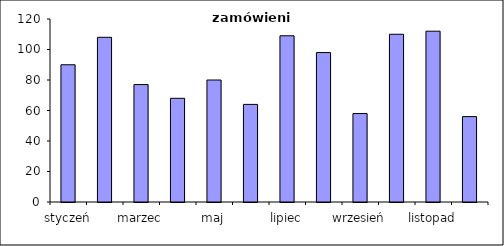
| Category | zamówienia |
|---|---|
| styczeń | 90 |
| luty | 108 |
| marzec | 77 |
| kwiecień | 68 |
| maj | 80 |
| czerwiec | 64 |
| lipiec | 109 |
| sierpień | 98 |
| wrzesień | 58 |
| październik | 110 |
| listopad | 112 |
| grudzień | 56 |